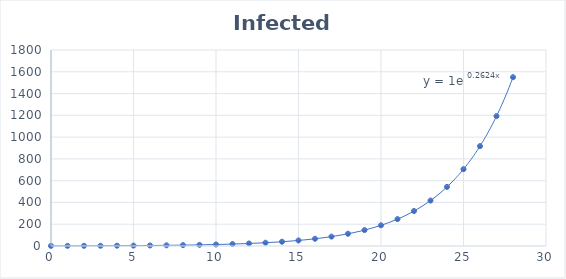
| Category | Series 0 |
|---|---|
| 0.0 | 1 |
| 1.0 | 1.3 |
| 2.0 | 1.69 |
| 3.0 | 2.197 |
| 4.0 | 2.856 |
| 5.0 | 3.713 |
| 6.0 | 4.827 |
| 7.0 | 6.275 |
| 8.0 | 8.157 |
| 9.0 | 10.604 |
| 10.0 | 13.786 |
| 11.0 | 17.922 |
| 12.0 | 23.298 |
| 13.0 | 30.288 |
| 14.0 | 39.374 |
| 15.0 | 51.186 |
| 16.0 | 66.542 |
| 17.0 | 86.504 |
| 18.0 | 112.455 |
| 19.0 | 146.192 |
| 20.0 | 190.05 |
| 21.0 | 247.065 |
| 22.0 | 321.184 |
| 23.0 | 417.539 |
| 24.0 | 542.801 |
| 25.0 | 705.641 |
| 26.0 | 917.333 |
| 27.0 | 1192.533 |
| 28.0 | 1550.293 |